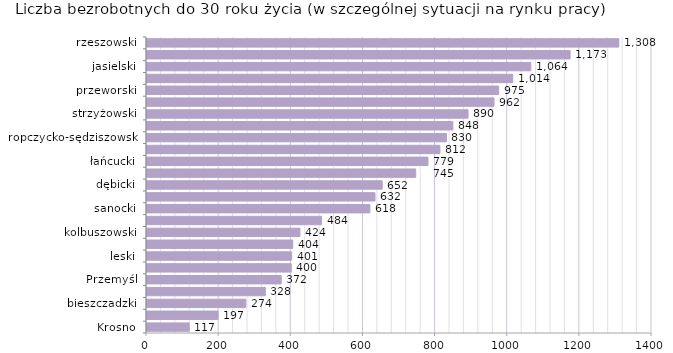
| Category | Liczba bezrobotnych do 30 roku życia - w szczególnej sytuacji na rynku pracy |
|---|---|
| Krosno | 117 |
| Tarnobrzeg | 197 |
| bieszczadzki | 274 |
| tarnobrzeski  | 328 |
| Przemyśl | 372 |
| lubaczowski | 400 |
| leski | 401 |
| krośnieński | 404 |
| kolbuszowski | 424 |
| stalowowolski | 484 |
| sanocki | 618 |
| mielecki | 632 |
| dębicki | 652 |
| przemyski | 745 |
| łańcucki | 779 |
| niżański | 812 |
| ropczycko-sędziszowski | 830 |
| leżajski | 848 |
| strzyżowski | 890 |
| brzozowski | 962 |
| przeworski | 975 |
| Rzeszów | 1014 |
| jasielski | 1064 |
| jarosławski | 1173 |
| rzeszowski | 1308 |